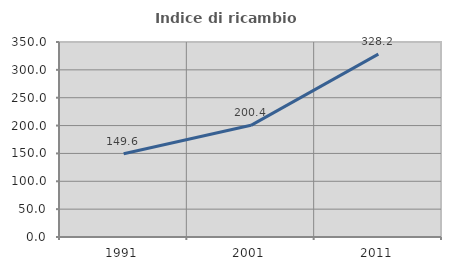
| Category | Indice di ricambio occupazionale  |
|---|---|
| 1991.0 | 149.553 |
| 2001.0 | 200.43 |
| 2011.0 | 328.241 |